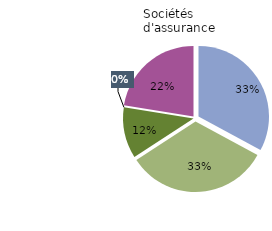
| Category | Sociétés d'assurance |
|---|---|
| Frais de soins  | 0.329 |
| Retraite, préretraite et indemnités de fin de carrière | 0.329 |
| Décès  | 0.117 |
| Nuptialité-natalité et perte d'emploi  | 0 |
| Autres dommages corporels* | 0.225 |